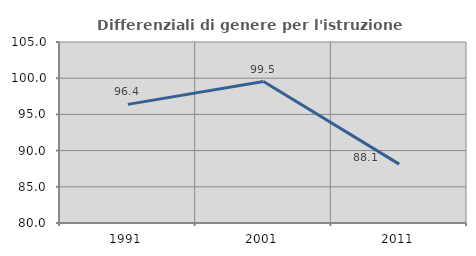
| Category | Differenziali di genere per l'istruzione superiore |
|---|---|
| 1991.0 | 96.387 |
| 2001.0 | 99.542 |
| 2011.0 | 88.131 |